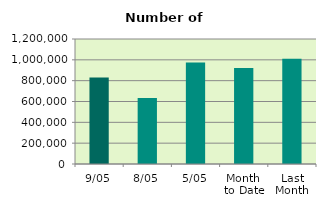
| Category | Series 0 |
|---|---|
| 9/05 | 831432 |
| 8/05 | 633830 |
| 5/05 | 974078 |
| Month 
to Date | 920640.333 |
| Last
Month | 1010681.333 |